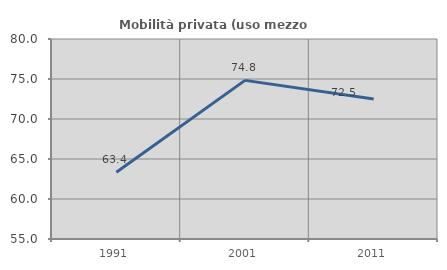
| Category | Mobilità privata (uso mezzo privato) |
|---|---|
| 1991.0 | 63.354 |
| 2001.0 | 74.83 |
| 2011.0 | 72.487 |